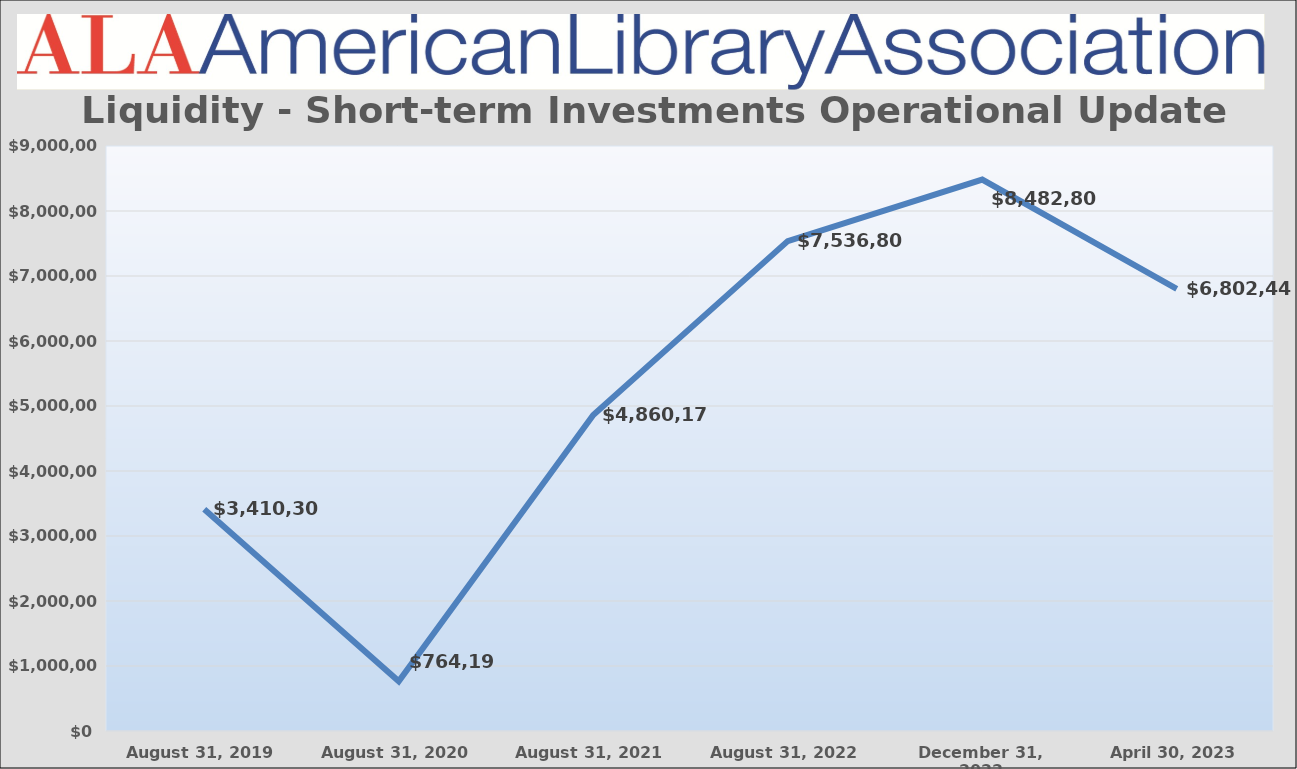
| Category | Series 0 |
|---|---|
| August 31, 2019 | 3410301.38 |
| August 31, 2020 | 764197.52 |
| August 31, 2021 | 4860179.15 |
| August 31, 2022 | 7536804.92 |
| December 31, 2022 | 8482808.64 |
| April 30, 2023 | 6802445 |